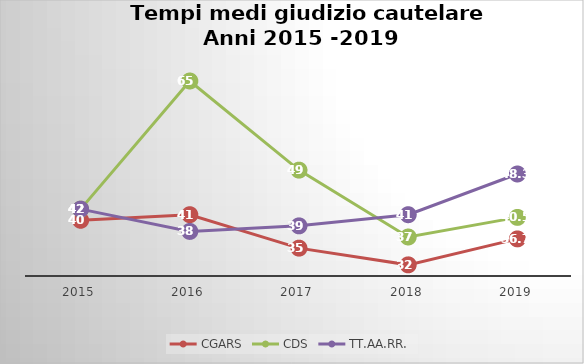
| Category | CGARS | CDS | TT.AA.RR. |
|---|---|---|---|
| 2015.0 | 40 | 42 | 42 |
| 2016.0 | 41 | 65 | 38 |
| 2017.0 | 35 | 49 | 39 |
| 2018.0 | 32 | 37 | 41 |
| 2019.0 | 36.66 | 40.52 | 48.307 |